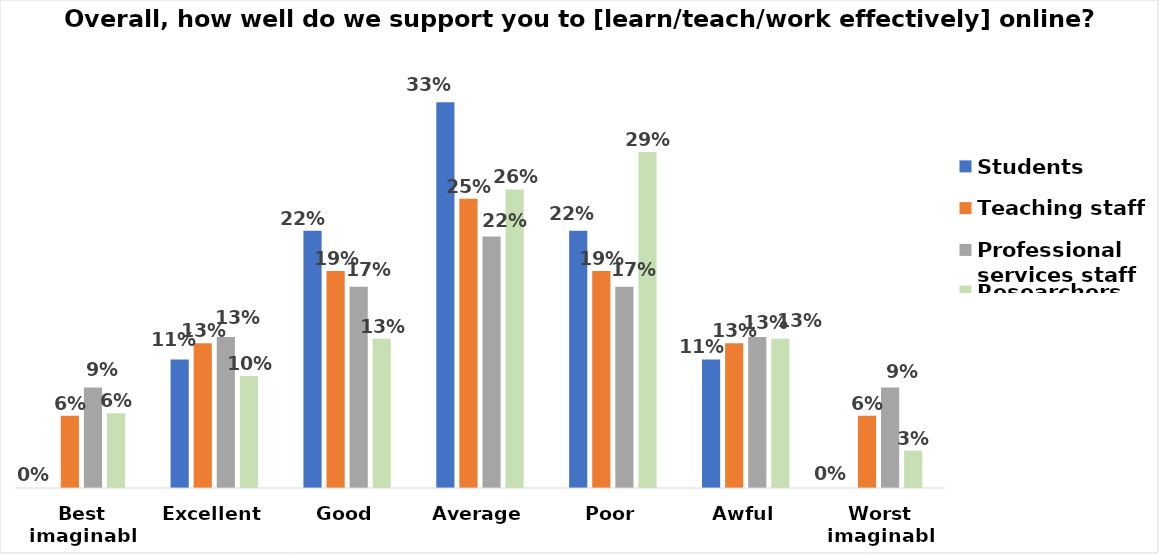
| Category | Students | Teaching staff | Professional services staff | Researchers |
|---|---|---|---|---|
| Best imaginable | 0 | 0.062 | 0.087 | 0.065 |
| Excellent | 0.111 | 0.125 | 0.13 | 0.097 |
| Good | 0.222 | 0.188 | 0.174 | 0.129 |
| Average | 0.333 | 0.25 | 0.217 | 0.258 |
| Poor | 0.222 | 0.188 | 0.174 | 0.29 |
| Awful | 0.111 | 0.125 | 0.13 | 0.129 |
| Worst imaginable | 0 | 0.062 | 0.087 | 0.032 |